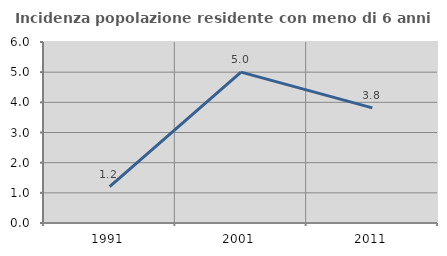
| Category | Incidenza popolazione residente con meno di 6 anni |
|---|---|
| 1991.0 | 1.205 |
| 2001.0 | 5 |
| 2011.0 | 3.817 |